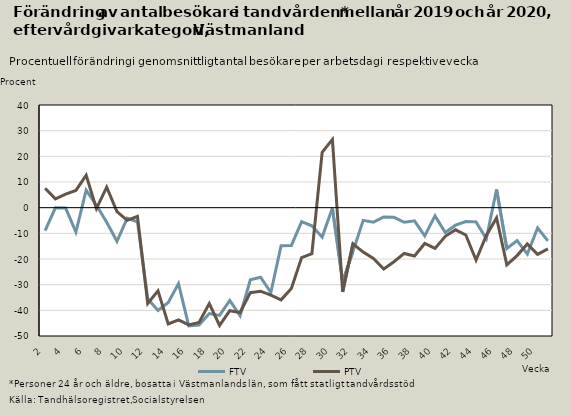
| Category | FTV | PTV |
|---|---|---|
| 2.0 | -8.973 | 7.556 |
| 3.0 | -0.053 | 3.41 |
| 4.0 | -0.165 | 5.273 |
| 5.0 | -9.534 | 6.71 |
| 6.0 | 6.813 | 12.64 |
| 7.0 | 0.927 | -0.377 |
| 8.0 | -5.714 | 7.966 |
| 9.0 | -13.087 | -1.52 |
| 10.0 | -4.114 | -4.954 |
| 11.0 | -5.553 | -3.355 |
| 12.0 | -35.513 | -37.331 |
| 13.0 | -40.049 | -32.413 |
| 14.0 | -36.95 | -45.297 |
| 15.0 | -29.56 | -43.736 |
| 16.0 | -46.061 | -45.679 |
| 17.0 | -45.755 | -44.737 |
| 18.0 | -41.281 | -37.392 |
| 19.0 | -41.973 | -45.884 |
| 20.0 | -36.171 | -40.131 |
| 21.0 | -42.065 | -40.836 |
| 22.0 | -28.097 | -33.12 |
| 23.0 | -27.097 | -32.535 |
| 24.0 | -33.056 | -34.069 |
| 25.0 | -14.833 | -35.919 |
| 26.0 | -14.708 | -31.504 |
| 27.0 | -5.478 | -19.453 |
| 28.0 | -7.085 | -17.938 |
| 29.0 | -11.461 | 21.594 |
| 30.0 | -0.176 | 26.587 |
| 31.0 | -28.818 | -32.795 |
| 32.0 | -17.11 | -14.08 |
| 33.0 | -4.939 | -17.308 |
| 34.0 | -5.664 | -19.81 |
| 35.0 | -3.633 | -23.884 |
| 36.0 | -3.774 | -21.047 |
| 37.0 | -5.679 | -17.828 |
| 38.0 | -5.119 | -18.827 |
| 39.0 | -10.981 | -13.954 |
| 40.0 | -3.202 | -15.867 |
| 41.0 | -9.71 | -11.151 |
| 42.0 | -6.827 | -8.62 |
| 43.0 | -5.389 | -10.662 |
| 44.0 | -5.526 | -20.402 |
| 45.0 | -12.118 | -10.809 |
| 46.0 | 7.067 | -3.986 |
| 47.0 | -15.925 | -22.261 |
| 48.0 | -12.827 | -18.681 |
| 49.0 | -18.081 | -14.164 |
| 50.0 | -7.905 | -18.201 |
| 51.0 | -12.946 | -16.052 |